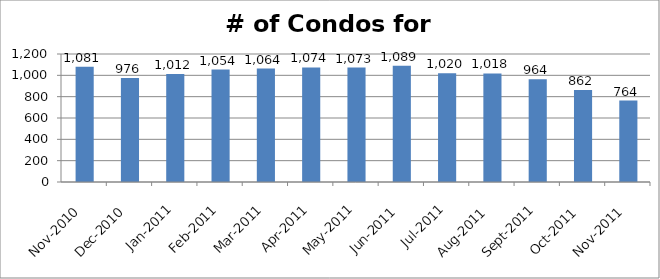
| Category | Series 0 |
|---|---|
| 2010-11-01 | 1081 |
| 2010-12-01 | 976 |
| 2011-01-01 | 1012 |
| 2011-02-01 | 1054 |
| 2011-03-01 | 1064 |
| 2011-04-01 | 1074 |
| 2011-05-01 | 1073 |
| 2011-06-01 | 1089 |
| 2011-07-01 | 1020 |
| 2011-08-01 | 1018 |
| 2011-09-01 | 964 |
| 2011-10-01 | 862 |
| 2011-11-01 | 764 |